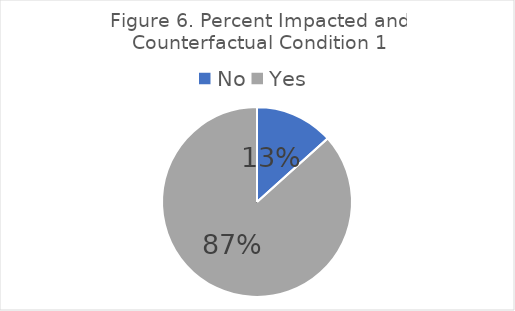
| Category | Impact by "counterfactual 1" |
|---|---|
| No | 2 |
| Yes | 13 |